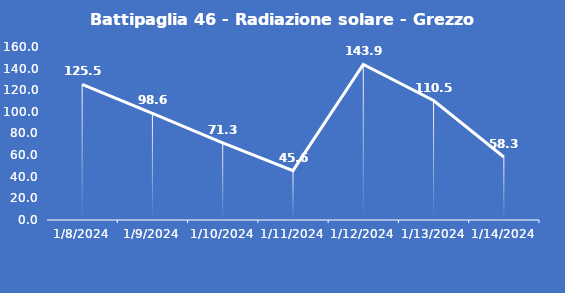
| Category | Battipaglia 46 - Radiazione solare - Grezzo (W/m2) |
|---|---|
| 1/8/24 | 125.5 |
| 1/9/24 | 98.6 |
| 1/10/24 | 71.3 |
| 1/11/24 | 45.6 |
| 1/12/24 | 143.9 |
| 1/13/24 | 110.5 |
| 1/14/24 | 58.3 |